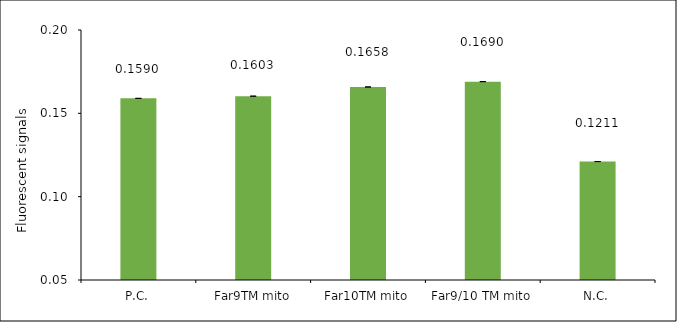
| Category | Series 0 |
|---|---|
| P.C. | 0.159 |
| Far9TM mito | 0.16 |
| Far10TM mito | 0.166 |
| Far9/10 TM mito | 0.169 |
| N.C. | 0.121 |